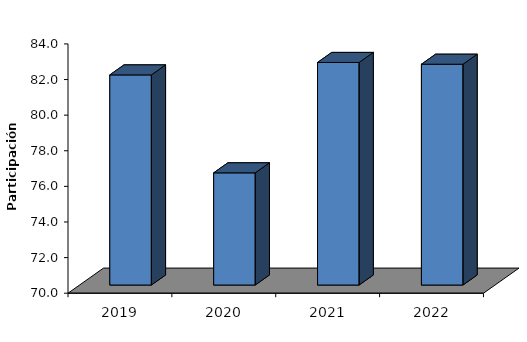
| Category | % Utilización |
|---|---|
| 2019-03-01 | 81.8 |
| 2020-03-01 | 76.3 |
| 2021-03-01 | 82.5 |
| 2022-03-01 | 82.4 |